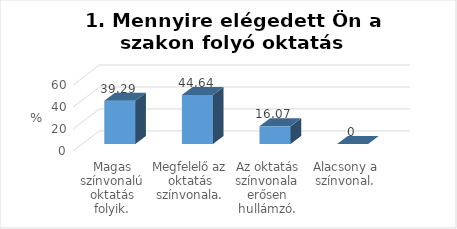
| Category | Series 0 |
|---|---|
| Magas színvonalú oktatás folyik. | 39.29 |
| Megfelelő az oktatás színvonala. | 44.64 |
| Az oktatás színvonala erősen hullámzó. | 16.07 |
| Alacsony a színvonal. | 0 |